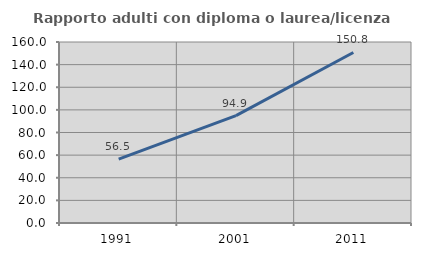
| Category | Rapporto adulti con diploma o laurea/licenza media  |
|---|---|
| 1991.0 | 56.467 |
| 2001.0 | 94.909 |
| 2011.0 | 150.756 |